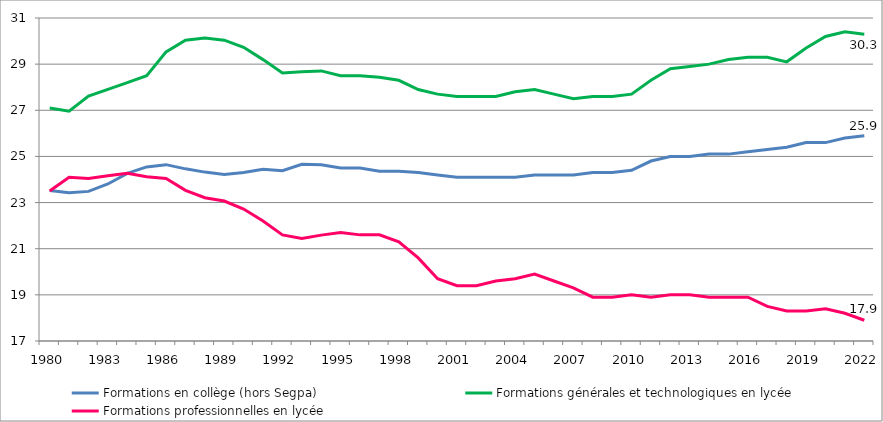
| Category | Formations en collège (hors Segpa) | Formations générales et technologiques en lycée | Formations professionnelles en lycée |
|---|---|---|---|
| 1980 | 23.523 | 27.1 | 23.5 |
| 1981 | 23.423 | 26.961 | 24.099 |
| 1982 | 23.485 | 27.62 | 24.043 |
| 1983 | 23.805 | 27.908 | 24.165 |
| 1984 | 24.267 | 28.202 | 24.266 |
| 1985 | 24.546 | 28.5 | 24.121 |
| 1986 | 24.644 | 29.532 | 24.044 |
| 1987 | 24.462 | 30.038 | 23.532 |
| 1988 | 24.321 | 30.138 | 23.21 |
| 1989 | 24.221 | 30.038 | 23.066 |
| 1990 | 24.3 | 29.732 | 22.721 |
| 1991 | 24.441 | 29.196 | 22.199 |
| 1992 | 24.382 | 28.62 | 21.6 |
| 1993 | 24.662 | 28.667 | 21.444 |
| 1994 | 24.641 | 28.708 | 21.589 |
| 1995 | 24.5 | 28.5 | 21.7 |
| 1996 | 24.5 | 28.5 | 21.6 |
| 1997 | 24.362 | 28.431 | 21.6 |
| 1998 | 24.362 | 28.3 | 21.3 |
| 1999 | 24.3 | 27.9 | 20.6 |
| 2000 | 24.2 | 27.7 | 19.7 |
| 2001 | 24.1 | 27.6 | 19.4 |
| 2002 | 24.1 | 27.6 | 19.4 |
| 2003 | 24.1 | 27.6 | 19.6 |
| 2004 | 24.1 | 27.8 | 19.7 |
| 2005 | 24.2 | 27.9 | 19.9 |
| 2006 | 24.2 | 27.7 | 19.6 |
| 2007 | 24.2 | 27.5 | 19.3 |
| 2008 | 24.3 | 27.6 | 18.9 |
| 2009 | 24.3 | 27.6 | 18.9 |
| 2010 | 24.4 | 27.7 | 19 |
| 2011 | 24.8 | 28.3 | 18.9 |
| 2012 | 25 | 28.8 | 19 |
| 2013 | 25 | 28.9 | 19 |
| 2014 | 25.1 | 29 | 18.9 |
| 2015 | 25.1 | 29.2 | 18.9 |
| 2016 | 25.2 | 29.3 | 18.9 |
| 2017 | 25.3 | 29.3 | 18.5 |
| 2018 | 25.4 | 29.1 | 18.3 |
| 2019 | 25.6 | 29.7 | 18.3 |
| 2020 | 25.6 | 30.2 | 18.4 |
| 2021 | 25.8 | 30.4 | 18.2 |
| 2022 | 25.9 | 30.3 | 17.9 |